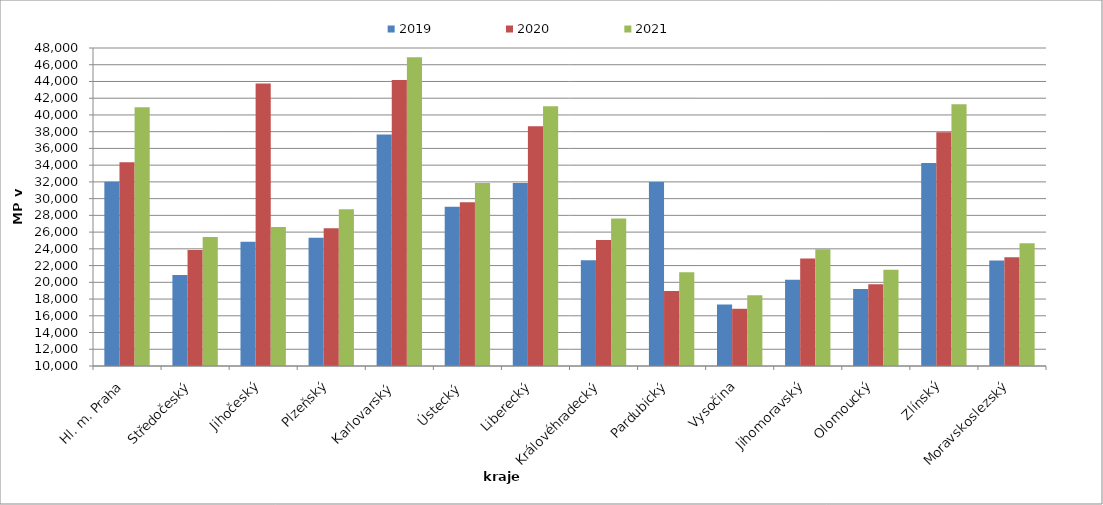
| Category | 2019 | 2020 | 2021 |
|---|---|---|---|
| Hl. m. Praha | 32009.535 | 34345.561 | 40918.588 |
| Středočeský | 20865.042 | 23857.488 | 25418.279 |
| Jihočeský | 24862.058 | 43760.668 | 26620.757 |
| Plzeňský | 25314.079 | 26457.568 | 28724.226 |
| Karlovarský  | 37673.563 | 44180 | 46899.512 |
| Ústecký   | 29044.472 | 29569.799 | 31864.715 |
| Liberecký | 31870.78 | 38661.406 | 41032.298 |
| Královéhradecký | 22651.149 | 25049.7 | 27618.599 |
| Pardubický | 31979.016 | 18957.626 | 21199.226 |
| Vysočina | 17337.822 | 16836.188 | 18451.524 |
| Jihomoravský | 20320.773 | 22859.79 | 23943.6 |
| Olomoucký | 19191.794 | 19783.33 | 21515.222 |
| Zlínský | 34257.023 | 37934.812 | 41269.428 |
| Moravskoslezský | 22611.027 | 22987.799 | 24677.12 |